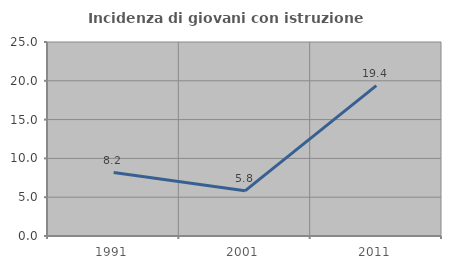
| Category | Incidenza di giovani con istruzione universitaria |
|---|---|
| 1991.0 | 8.182 |
| 2001.0 | 5.825 |
| 2011.0 | 19.388 |